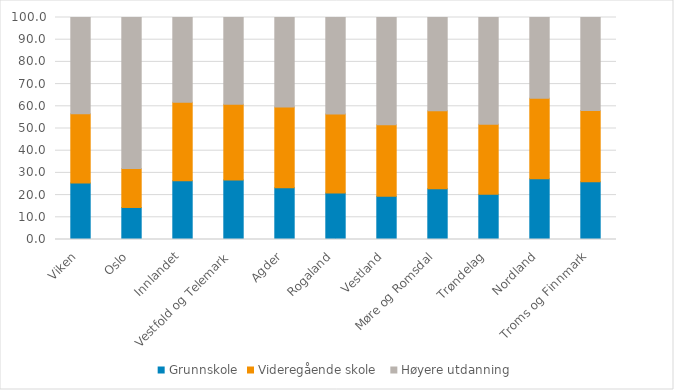
| Category | Grunnskole | Videregående skole  | Høyere utdanning |
|---|---|---|---|
| Viken | 25.399 | 31.247 | 43.353 |
| Oslo | 14.427 | 17.511 | 68.062 |
| Innlandet | 26.517 | 35.257 | 38.226 |
| Vestfold og Telemark | 26.782 | 34.126 | 39.092 |
| Agder | 23.288 | 36.391 | 40.321 |
| Rogaland | 20.938 | 35.65 | 43.412 |
| Vestland | 19.444 | 32.278 | 48.278 |
| Møre og Romsdal | 22.851 | 35.108 | 42.041 |
| Trøndelag | 20.368 | 31.543 | 48.089 |
| Nordland | 27.345 | 36.252 | 36.402 |
| Troms og Finnmark | 26.054 | 32.073 | 41.872 |